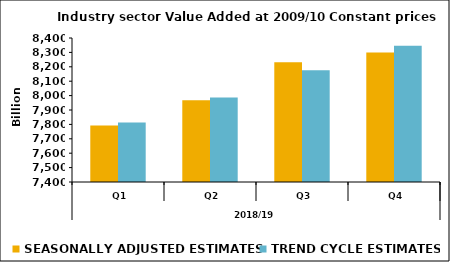
| Category | SEASONALLY ADJUSTED ESTIMATES | TREND CYCLE ESTIMATES |
|---|---|---|
| 0 | 7792.044 | 7813.157 |
| 1 | 7967.036 | 7987.323 |
| 2 | 8231.473 | 8176.185 |
| 3 | 8299.524 | 8346.823 |